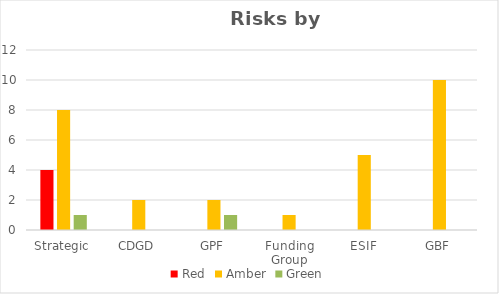
| Category | Red | Amber | Green |
|---|---|---|---|
| Strategic | 4 | 8 | 1 |
| CDGD | 0 | 2 | 0 |
| GPF | 0 | 2 | 1 |
| Funding Group | 0 | 1 | 0 |
| ESIF | 0 | 5 | 0 |
| GBF | 0 | 10 | 0 |